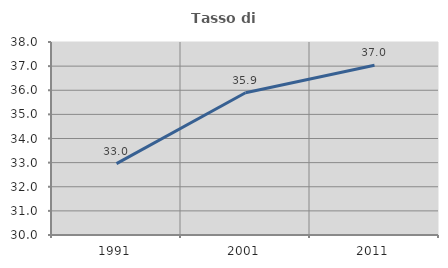
| Category | Tasso di occupazione   |
|---|---|
| 1991.0 | 32.961 |
| 2001.0 | 35.895 |
| 2011.0 | 37.033 |